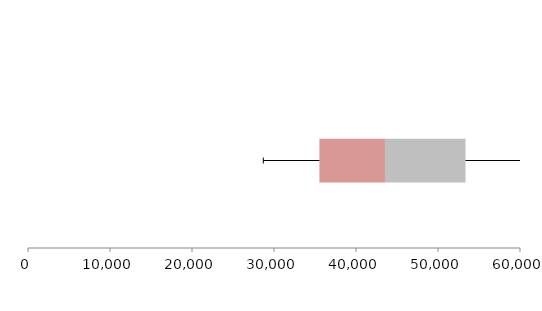
| Category | Series 1 | Series 2 | Series 3 |
|---|---|---|---|
| 0 | 35537.738 | 7993.481 | 9821.608 |